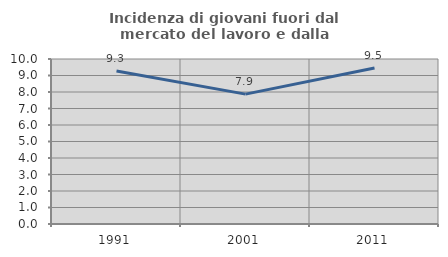
| Category | Incidenza di giovani fuori dal mercato del lavoro e dalla formazione  |
|---|---|
| 1991.0 | 9.274 |
| 2001.0 | 7.87 |
| 2011.0 | 9.459 |